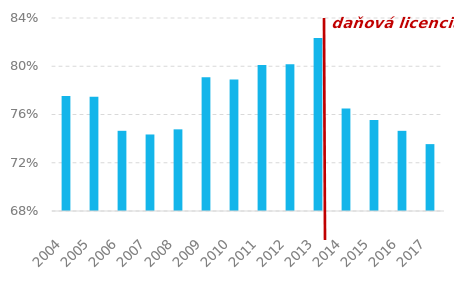
| Category | Series 0 |
|---|---|
| 2004.0 | 0.775 |
| 2005.0 | 0.775 |
| 2006.0 | 0.746 |
| 2007.0 | 0.743 |
| 2008.0 | 0.748 |
| 2009.0 | 0.791 |
| 2010.0 | 0.789 |
| 2011.0 | 0.801 |
| 2012.0 | 0.802 |
| 2013.0 | 0.823 |
| 2014.0 | 0.765 |
| 2015.0 | 0.756 |
| 2016.0 | 0.746 |
| 2017.0 | 0.735 |